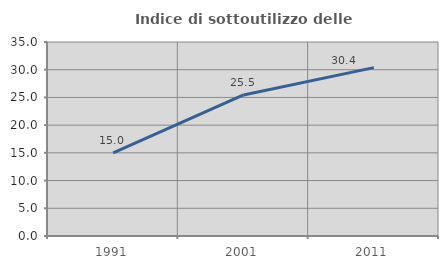
| Category | Indice di sottoutilizzo delle abitazioni  |
|---|---|
| 1991.0 | 15 |
| 2001.0 | 25.455 |
| 2011.0 | 30.372 |